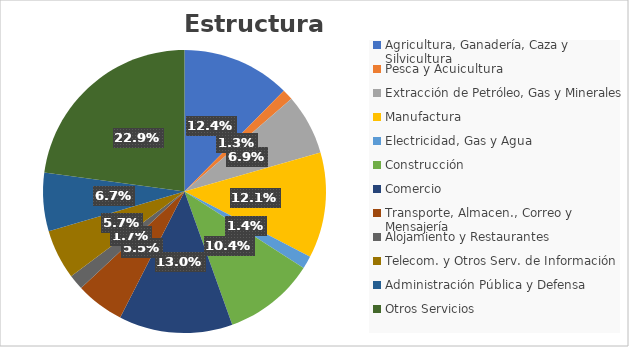
| Category | Series 0 |
|---|---|
| Agricultura, Ganadería, Caza y Silvicultura | 8858644 |
| Pesca y Acuicultura | 899618 |
| Extracción de Petróleo, Gas y Minerales | 4942098 |
| Manufactura | 8651902 |
| Electricidad, Gas y Agua | 1037049 |
| Construcción | 7469546 |
| Comercio | 9294278 |
| Transporte, Almacen., Correo y Mensajería | 3963249 |
| Alojamiento y Restaurantes | 1244334 |
| Telecom. y Otros Serv. de Información | 4070975 |
| Administración Pública y Defensa | 4774379 |
| Otros Servicios | 16352959 |